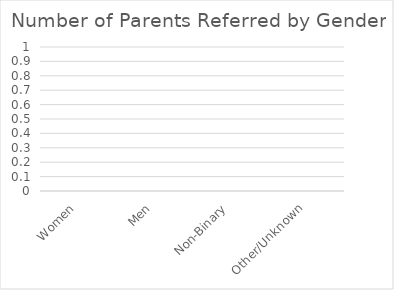
| Category | Referred |
|---|---|
| Women | 0 |
| Men | 0 |
| Non-Binary | 0 |
| Other/Unknown | 0 |